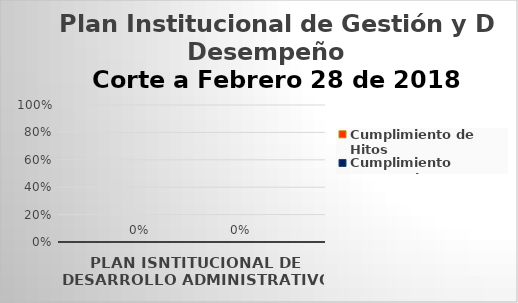
| Category | Cumplimiento de Hitos | Cumplimiento Temporal |
|---|---|---|
| PLAN ISNTITUCIONAL DE DESARROLLO ADMINISTRATIVO | 0 | 0 |